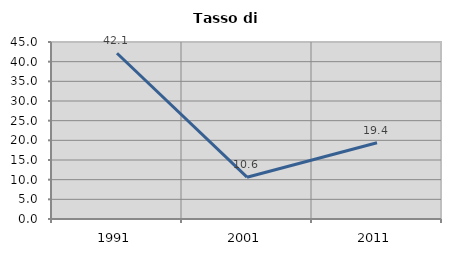
| Category | Tasso di disoccupazione   |
|---|---|
| 1991.0 | 42.136 |
| 2001.0 | 10.628 |
| 2011.0 | 19.388 |